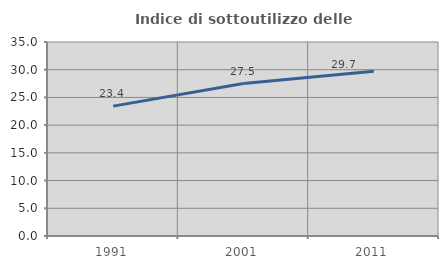
| Category | Indice di sottoutilizzo delle abitazioni  |
|---|---|
| 1991.0 | 23.433 |
| 2001.0 | 27.501 |
| 2011.0 | 29.712 |